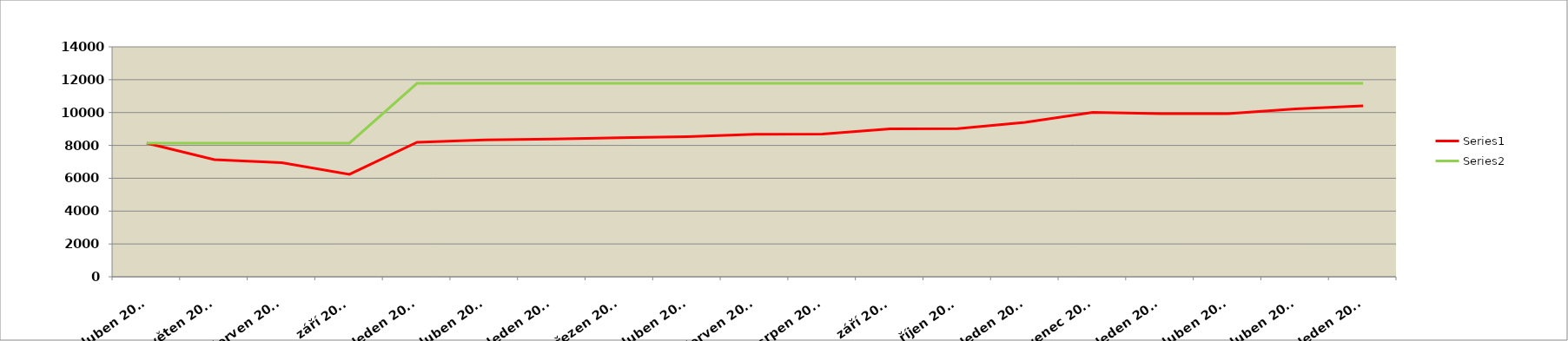
| Category | Series 0 | Series 1 |
|---|---|---|
| duben 2011 | 8136 | 8136 |
| květen 2011 | 7136 | 8136 |
| červen 2011 | 6951 | 8136 |
| září 2011 | 6237 | 8136 |
| leden 2012 | 8190 | 11778 |
| duben 2012 | 8329 | 11778 |
| leden 2013 | 8382 | 11778 |
| březen 2013 | 8472 | 11778 |
| duben 2013 | 8532 | 11778 |
| červen 2013 | 8676 | 11778 |
| srpen 2013 | 8692 | 11778 |
| září 2013 | 9011 | 11778 |
| říjen 2013 | 9020 | 11778 |
| leden 2014 | 9407 | 11778 |
| červenec 2014 | 10007 | 11778 |
| leden 2015 | 9937 | 11778 |
| duben 2015 | 9927 | 11778 |
| duben 2015 | 10227 | 11778 |
| leden 2016 | 10408 | 11778 |